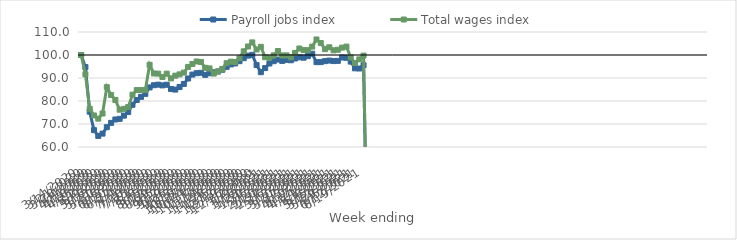
| Category | Payroll jobs index | Total wages index |
|---|---|---|
| 14/03/2020 | 100 | 100 |
| 21/03/2020 | 94.743 | 91.641 |
| 28/03/2020 | 75.365 | 76.621 |
| 04/04/2020 | 67.329 | 73.71 |
| 11/04/2020 | 64.817 | 72.326 |
| 18/04/2020 | 65.823 | 74.565 |
| 25/04/2020 | 68.616 | 86.021 |
| 02/05/2020 | 70.481 | 82.618 |
| 09/05/2020 | 71.969 | 80.445 |
| 16/05/2020 | 72.234 | 76.221 |
| 23/05/2020 | 73.636 | 76.587 |
| 30/05/2020 | 75.196 | 77.359 |
| 06/06/2020 | 78.37 | 82.754 |
| 13/06/2020 | 80.438 | 84.748 |
| 20/06/2020 | 81.799 | 84.749 |
| 27/06/2020 | 83.105 | 84.749 |
| 04/07/2020 | 85.899 | 95.729 |
| 11/07/2020 | 86.86 | 91.964 |
| 18/07/2020 | 87.109 | 91.906 |
| 25/07/2020 | 86.788 | 90.45 |
| 01/08/2020 | 87.08 | 91.895 |
| 08/08/2020 | 85.185 | 89.822 |
| 15/08/2020 | 84.965 | 91.003 |
| 22/08/2020 | 86.098 | 91.585 |
| 29/08/2020 | 87.424 | 92.338 |
| 05/09/2020 | 89.778 | 94.816 |
| 12/09/2020 | 91.486 | 96.096 |
| 19/09/2020 | 92.106 | 97.183 |
| 26/09/2020 | 92.251 | 96.972 |
| 03/10/2020 | 91.374 | 94.443 |
| 10/10/2020 | 92.066 | 94.168 |
| 17/10/2020 | 92.478 | 91.923 |
| 24/10/2020 | 92.858 | 92.822 |
| 31/10/2020 | 93.593 | 93.956 |
| 07/11/2020 | 94.836 | 96.44 |
| 14/11/2020 | 95.905 | 97.106 |
| 21/11/2020 | 96.328 | 96.946 |
| 28/11/2020 | 97.322 | 98.6 |
| 05/12/2020 | 98.618 | 101.603 |
| 12/12/2020 | 99.727 | 103.689 |
| 19/12/2020 | 100.062 | 105.482 |
| 26/12/2020 | 95.632 | 102.388 |
| 02/01/2021 | 92.53 | 103.55 |
| 09/01/2021 | 94.313 | 99.025 |
| 16/01/2021 | 96.305 | 98.806 |
| 23/01/2021 | 97.314 | 99.824 |
| 30/01/2021 | 98.024 | 101.726 |
| 06/02/2021 | 97.424 | 99.797 |
| 13/02/2021 | 97.883 | 99.826 |
| 20/02/2021 | 97.708 | 99 |
| 27/02/2021 | 98.467 | 100.918 |
| 06/03/2021 | 98.983 | 102.832 |
| 13/03/2021 | 98.833 | 102.123 |
| 20/03/2021 | 99.516 | 102.096 |
| 27/03/2021 | 100.557 | 103.654 |
| 03/04/2021 | 96.883 | 106.755 |
| 10/04/2021 | 96.913 | 105.206 |
| 17/04/2021 | 97.327 | 102.531 |
| 24/04/2021 | 97.574 | 103.351 |
| 01/05/2021 | 97.361 | 102.036 |
| 08/05/2021 | 97.448 | 102.294 |
| 15/05/2021 | 98.897 | 103.203 |
| 22/05/2021 | 98.785 | 103.654 |
| 29/05/2021 | 97.125 | 98.95 |
| 05/06/2021 | 94.203 | 96.527 |
| 12/06/2021 | 94.129 | 98.101 |
| 19/06/2021 | 95.557 | 99.722 |